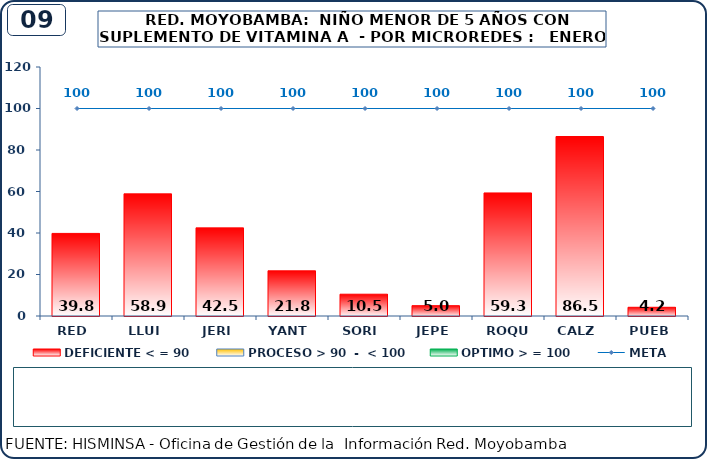
| Category | DEFICIENTE < = 90 | PROCESO > 90  -  < 100 | OPTIMO > = 100 |
|---|---|---|---|
| RED | 39.8 | 0 | 0 |
| LLUI | 58.9 | 0 | 0 |
| JERI | 42.5 | 0 | 0 |
| YANT | 21.8 | 0 | 0 |
| SORI | 10.5 | 0 | 0 |
| JEPE | 5 | 0 | 0 |
| ROQU | 59.3 | 0 | 0 |
| CALZ | 86.5 | 0 | 0 |
| PUEB | 4.2 | 0 | 0 |